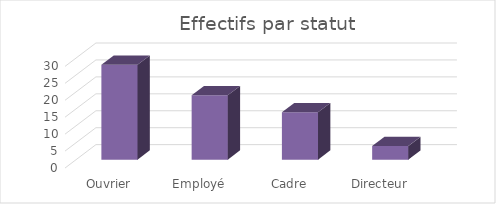
| Category | Nombre  |
|---|---|
| Ouvrier | 28 |
| Employé | 19 |
| Cadre | 14 |
| Directeur | 4 |